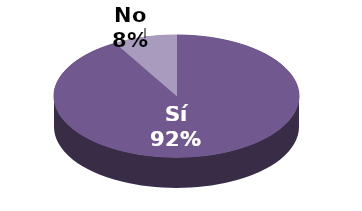
| Category | Series 1 |
|---|---|
| Sí | 66 |
| No | 6 |